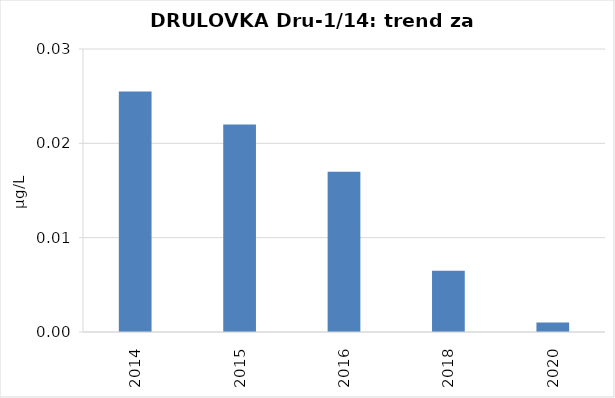
| Category | Vsota |
|---|---|
| 2014 | 0.026 |
| 2015 | 0.022 |
| 2016 | 0.017 |
| 2018 | 0.007 |
| 2020 | 0.001 |